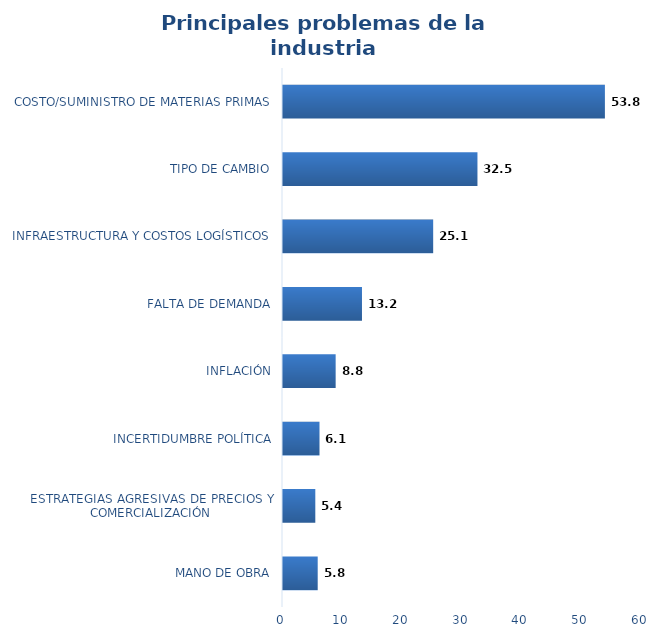
| Category | Series 0 |
|---|---|
| MANO DE OBRA | 5.8 |
| ESTRATEGIAS AGRESIVAS DE PRECIOS Y COMERCIALIZACIÓN | 5.4 |
| INCERTIDUMBRE POLÍTICA | 6.1 |
| INFLACIÓN | 8.8 |
| FALTA DE DEMANDA | 13.2 |
| INFRAESTRUCTURA Y COSTOS LOGÍSTICOS | 25.1 |
| TIPO DE CAMBIO | 32.5 |
| COSTO/SUMINISTRO DE MATERIAS PRIMAS | 53.8 |